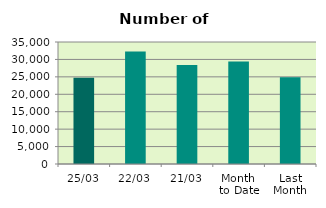
| Category | Series 0 |
|---|---|
| 25/03 | 24738 |
| 22/03 | 32302 |
| 21/03 | 28376 |
| Month 
to Date | 29379.059 |
| Last
Month | 24872.2 |